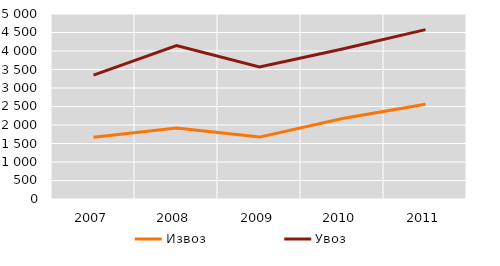
| Category | Извоз | Увоз |
|---|---|---|
| 2007.0 | 1672 | 3348 |
| 2008.0 | 1922 | 4147 |
| 2009.0 | 1673 | 3568 |
| 2010.0 | 2178 | 4053 |
| 2011.0 | 2561 | 4578 |